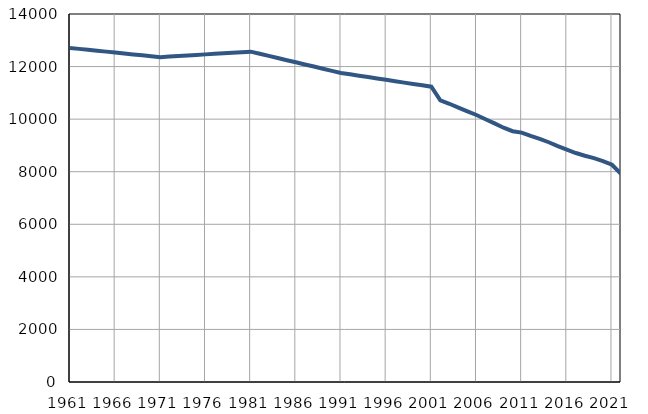
| Category | Population
size |
|---|---|
| 1961.0 | 12709 |
| 1962.0 | 12673 |
| 1963.0 | 12639 |
| 1964.0 | 12604 |
| 1965.0 | 12569 |
| 1966.0 | 12533 |
| 1967.0 | 12499 |
| 1968.0 | 12463 |
| 1969.0 | 12429 |
| 1970.0 | 12394 |
| 1971.0 | 12359 |
| 1972.0 | 12380 |
| 1973.0 | 12401 |
| 1974.0 | 12422 |
| 1975.0 | 12443 |
| 1976.0 | 12464 |
| 1977.0 | 12484 |
| 1978.0 | 12505 |
| 1979.0 | 12526 |
| 1980.0 | 12547 |
| 1981.0 | 12568 |
| 1982.0 | 12486 |
| 1983.0 | 12406 |
| 1984.0 | 12324 |
| 1985.0 | 12243 |
| 1986.0 | 12162 |
| 1987.0 | 12081 |
| 1988.0 | 12000 |
| 1989.0 | 11919 |
| 1990.0 | 11838 |
| 1991.0 | 11757 |
| 1992.0 | 11705 |
| 1993.0 | 11652 |
| 1994.0 | 11600 |
| 1995.0 | 11548 |
| 1996.0 | 11495 |
| 1997.0 | 11444 |
| 1998.0 | 11390 |
| 1999.0 | 11339 |
| 2000.0 | 11286 |
| 2001.0 | 11234 |
| 2002.0 | 10718 |
| 2003.0 | 10585 |
| 2004.0 | 10439 |
| 2005.0 | 10295 |
| 2006.0 | 10157 |
| 2007.0 | 9998 |
| 2008.0 | 9837 |
| 2009.0 | 9675 |
| 2010.0 | 9542 |
| 2011.0 | 9489 |
| 2012.0 | 9363 |
| 2013.0 | 9252 |
| 2014.0 | 9121 |
| 2015.0 | 8971 |
| 2016.0 | 8837 |
| 2017.0 | 8711 |
| 2018.0 | 8606 |
| 2019.0 | 8519 |
| 2020.0 | 8406 |
| 2021.0 | 8264 |
| 2022.0 | 7917 |